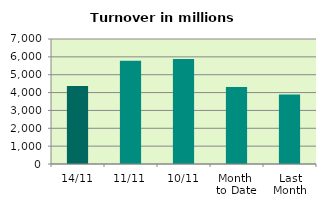
| Category | Series 0 |
|---|---|
| 14/11 | 4372.067 |
| 11/11 | 5783.274 |
| 10/11 | 5873.605 |
| Month 
to Date | 4306.443 |
| Last
Month | 3895.685 |